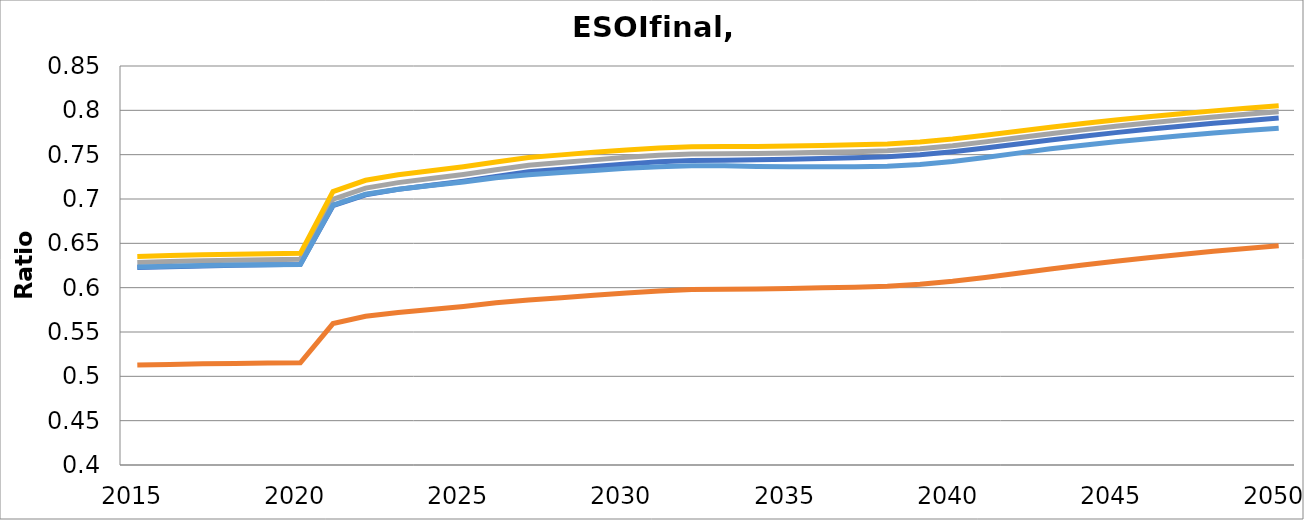
| Category |  ESOIfinal [LMO] |  ESOIfinal [NMC622] |  ESOIfinal [NMC811] |  ESOIfinal [NCA] |  ESOIfinal [LFP] |
|---|---|---|---|---|---|
| 2015.0 | 0.513 | 0.623 | 0.628 | 0.635 | 0.623 |
| 2016.0 | 0.513 | 0.624 | 0.629 | 0.636 | 0.624 |
| 2017.0 | 0.514 | 0.625 | 0.63 | 0.637 | 0.625 |
| 2018.0 | 0.515 | 0.625 | 0.631 | 0.638 | 0.625 |
| 2019.0 | 0.515 | 0.626 | 0.632 | 0.638 | 0.626 |
| 2020.0 | 0.515 | 0.626 | 0.632 | 0.639 | 0.626 |
| 2021.0 | 0.559 | 0.692 | 0.7 | 0.708 | 0.693 |
| 2022.0 | 0.568 | 0.705 | 0.712 | 0.721 | 0.705 |
| 2023.0 | 0.572 | 0.711 | 0.718 | 0.727 | 0.711 |
| 2024.0 | 0.575 | 0.715 | 0.723 | 0.732 | 0.715 |
| 2025.0 | 0.579 | 0.72 | 0.728 | 0.736 | 0.719 |
| 2026.0 | 0.583 | 0.725 | 0.733 | 0.742 | 0.724 |
| 2027.0 | 0.586 | 0.731 | 0.738 | 0.747 | 0.727 |
| 2028.0 | 0.589 | 0.734 | 0.741 | 0.75 | 0.73 |
| 2029.0 | 0.591 | 0.737 | 0.744 | 0.753 | 0.732 |
| 2030.0 | 0.594 | 0.74 | 0.747 | 0.755 | 0.735 |
| 2031.0 | 0.596 | 0.742 | 0.749 | 0.758 | 0.737 |
| 2032.0 | 0.598 | 0.743 | 0.751 | 0.759 | 0.738 |
| 2033.0 | 0.598 | 0.744 | 0.751 | 0.759 | 0.738 |
| 2034.0 | 0.599 | 0.744 | 0.751 | 0.759 | 0.737 |
| 2035.0 | 0.599 | 0.745 | 0.752 | 0.76 | 0.736 |
| 2036.0 | 0.6 | 0.746 | 0.753 | 0.76 | 0.736 |
| 2037.0 | 0.601 | 0.746 | 0.753 | 0.761 | 0.736 |
| 2038.0 | 0.602 | 0.748 | 0.755 | 0.762 | 0.737 |
| 2039.0 | 0.604 | 0.75 | 0.757 | 0.764 | 0.739 |
| 2040.0 | 0.607 | 0.753 | 0.76 | 0.768 | 0.742 |
| 2041.0 | 0.612 | 0.757 | 0.764 | 0.772 | 0.747 |
| 2042.0 | 0.616 | 0.762 | 0.769 | 0.776 | 0.752 |
| 2043.0 | 0.621 | 0.767 | 0.774 | 0.781 | 0.757 |
| 2044.0 | 0.625 | 0.771 | 0.778 | 0.785 | 0.761 |
| 2045.0 | 0.63 | 0.775 | 0.782 | 0.789 | 0.764 |
| 2046.0 | 0.634 | 0.779 | 0.786 | 0.793 | 0.768 |
| 2047.0 | 0.637 | 0.782 | 0.789 | 0.796 | 0.771 |
| 2048.0 | 0.641 | 0.785 | 0.792 | 0.799 | 0.774 |
| 2049.0 | 0.644 | 0.788 | 0.796 | 0.802 | 0.777 |
| 2050.0 | 0.647 | 0.791 | 0.798 | 0.805 | 0.78 |